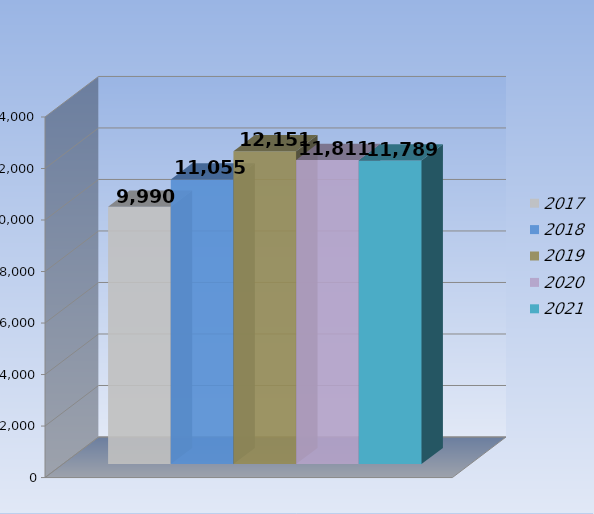
| Category | 2017 | 2018 | 2019 | 2020 | 2021 |
|---|---|---|---|---|---|
| 0 | 9990 | 11055 | 12151 | 11811 | 11789 |